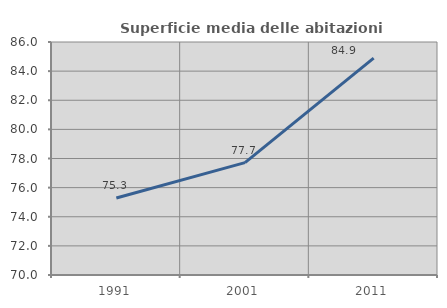
| Category | Superficie media delle abitazioni occupate |
|---|---|
| 1991.0 | 75.286 |
| 2001.0 | 77.713 |
| 2011.0 | 84.895 |